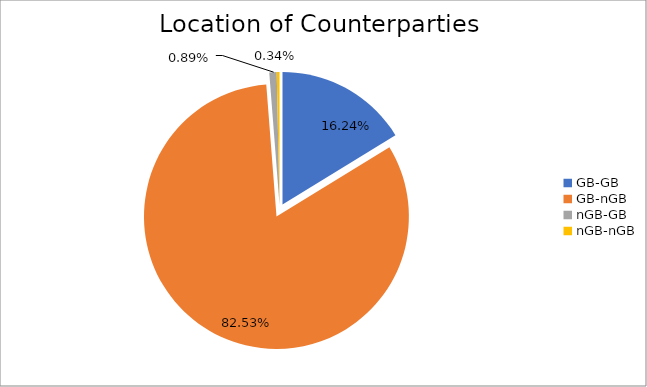
| Category | Series 0 |
|---|---|
| GB-GB | 1582431.922 |
| GB-nGB | 8042386.183 |
| nGB-GB | 87097.891 |
| nGB-nGB | 32824.693 |